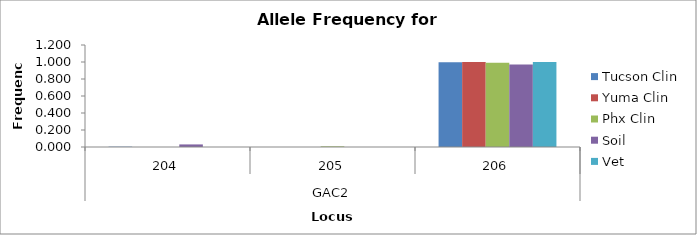
| Category | Tucson Clin | Yuma Clin | Phx Clin | Soil | Vet |
|---|---|---|---|---|---|
| 0 | 0.004 | 0 | 0 | 0.03 | 0 |
| 1 | 0 | 0 | 0.008 | 0 | 0 |
| 2 | 0.996 | 1 | 0.992 | 0.97 | 1 |